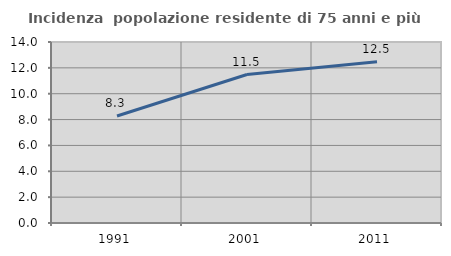
| Category | Incidenza  popolazione residente di 75 anni e più |
|---|---|
| 1991.0 | 8.278 |
| 2001.0 | 11.482 |
| 2011.0 | 12.47 |